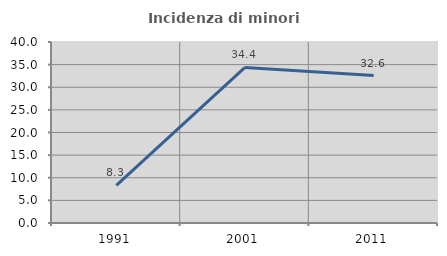
| Category | Incidenza di minori stranieri |
|---|---|
| 1991.0 | 8.333 |
| 2001.0 | 34.375 |
| 2011.0 | 32.579 |